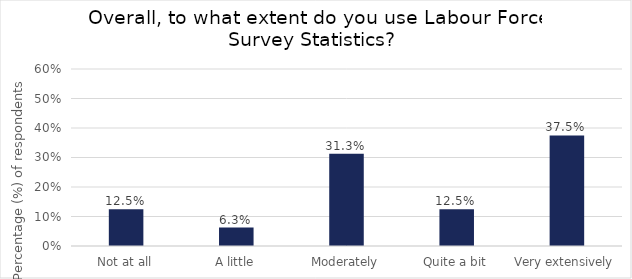
| Category | Series 0 |
|---|---|
| Not at all | 0.125 |
| A little | 0.062 |
| Moderately | 0.312 |
| Quite a bit | 0.125 |
| Very extensively | 0.375 |